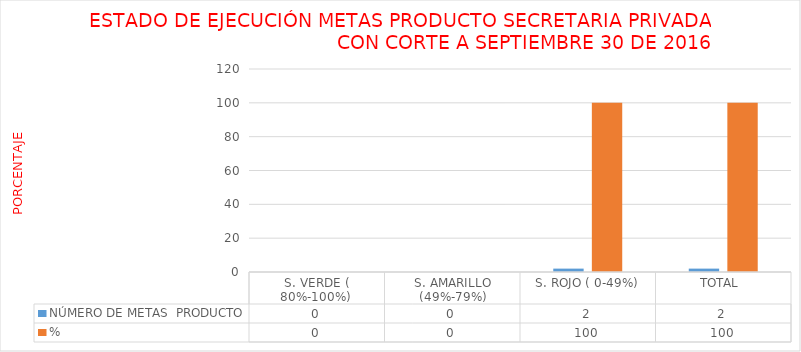
| Category | NÚMERO DE METAS  PRODUCTO  | % |
|---|---|---|
| S. VERDE ( 80%-100%)  | 0 | 0 |
| S. AMARILLO (49%-79%) | 0 | 0 |
| S. ROJO ( 0-49%) | 2 | 100 |
| TOTAL  | 2 | 100 |